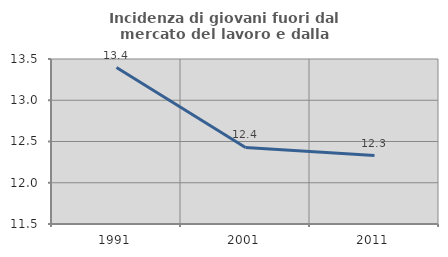
| Category | Incidenza di giovani fuori dal mercato del lavoro e dalla formazione  |
|---|---|
| 1991.0 | 13.396 |
| 2001.0 | 12.428 |
| 2011.0 | 12.33 |